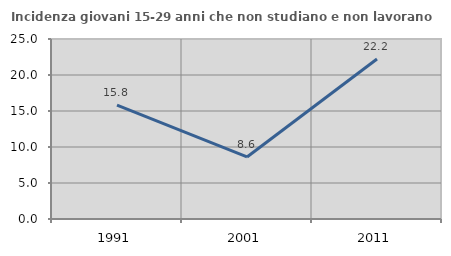
| Category | Incidenza giovani 15-29 anni che non studiano e non lavorano  |
|---|---|
| 1991.0 | 15.805 |
| 2001.0 | 8.621 |
| 2011.0 | 22.222 |